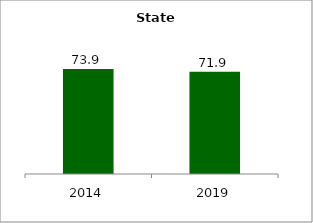
| Category | State |
|---|---|
| 2014.0 | 73.912 |
| 2019.0 | 71.935 |